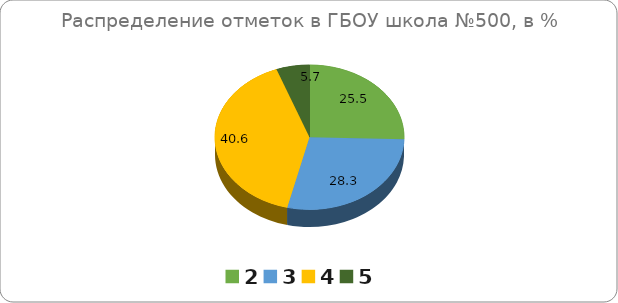
| Category | ГБОУ СОШ №500 |
|---|---|
| 2.0 | 25.47 |
| 3.0 | 28.3 |
| 4.0 | 40.57 |
| 5.0 | 5.66 |